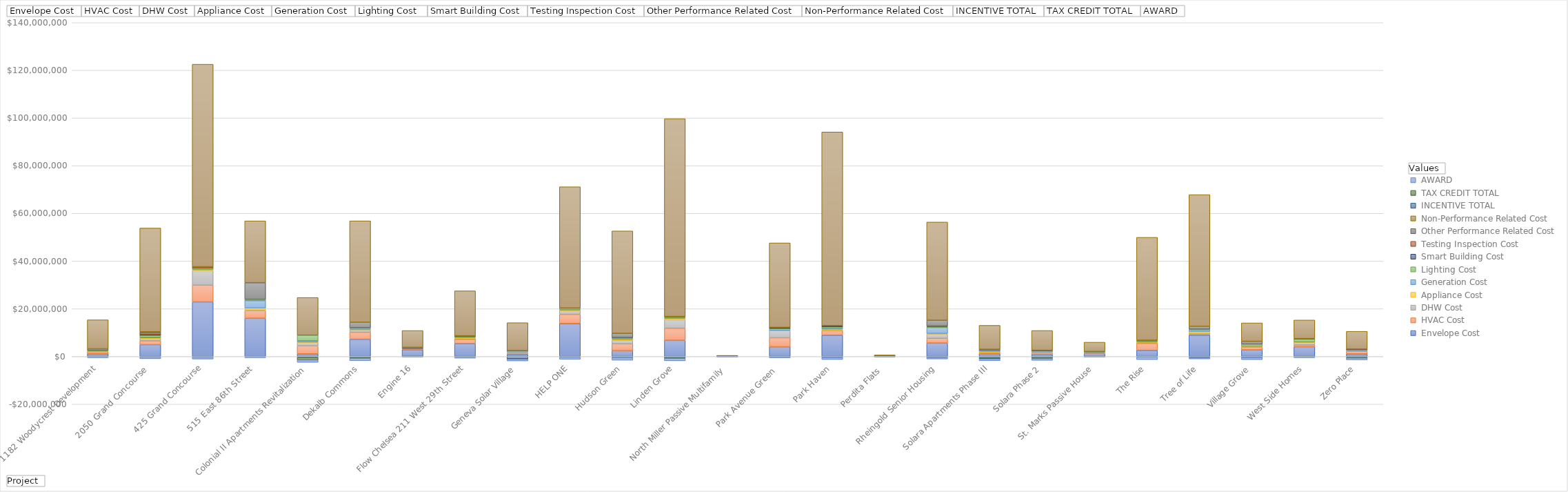
| Category |  Envelope Cost |  HVAC Cost |  DHW Cost |  Appliance Cost |  Generation Cost |  Lighting Cost  |  Smart Building Cost |  Testing Inspection Cost |  Other Performance Related Cost |  Non-Performance Related Cost |  INCENTIVE TOTAL |  TAX CREDIT TOTAL |  AWARD |
|---|---|---|---|---|---|---|---|---|---|---|---|---|---|
| 1182 Woodycrest Development | 1130801.59 | 879051 | 240000 | 140736 | 0 | 200000 | 0 | 0 | 645948 | 12128463.81 | -169700 | 0 | -350931 |
| 2050 Grand Concourse  | 4967658.213 | 1592848.164 | 1059435.67 | 183414 | 254596.04 | 807248.033 | 325541.73 | 689125 | 502235.25 | 43460922.157 | -235624 | -55599 | -647500 |
| 425 Grand Concourse | 22898351.84 | 6998906 | 6106206 | 434701 | 0 | 617156 | 0 | 546700 | 50300 | 84887679.16 | -300000 | 0 | -750000 |
| 515 East 86th Street  | 16052777 | 3168000 | 307000 | 788116 | 3072683 | 553272 | 0 | 0 | 7001039.706 | 25917381.706 | -99617.8 | 0 | -425000 |
| Colonial II Apartments Revitalization | 1096000 | 3357410 | 1467133 | 169375 | 505440 | 2335100 | 0 | 0 | 0 | 15804978 | -459000 | -990064 | -1000000 |
| Dekalb Commons | 7230000 | 2925000 | 1050000 | 151700 | 374500 | 340000 | 0 | 0 | 2283800 | 42507863.5 | -619232 | -111363 | -1000000 |
| Engine 16 | 2859020.71 | 245125 | 153472 | 69500 | 39415 | 41750 | 0 | 0 | 423479.42 | 7052230.21 | -6400 | -19088 | -167458.5 |
| Flow Chelsea 211 West 29th Street | 5414207.77 | 1755748.5 | 356582 | 462963.94 | 157000 | 246715.67 | 50000 | 53050 | 198249.76 | 18820784.21 | -145660 | -49394 | -500000 |
| Geneva Solar Village | 823994 | 520783 | 73950 | 410325 | 571158 | 41511 | 0 | 0 | 64637.931 | 11648847 | -978000 | -140885 | -727236 |
| HELP ONE | 13820490 | 3860000 | 1521600 | 291269 | 263398 | 468693 | 0 | 142906 | 0 | 50797762.19 | -300000 | 0 | -850000 |
| Hudson Green | 2407694.931 | 2900092.81 | 1545000 | 374147 | 411400 | 281632.424 | 0 | 37000 | 1742800 | 42929555.668 | -555000 | 0 | -1000000 |
| Linden Grove | 6779865.441 | 5074592.04 | 3559889.291 | 572717.547 | 232500 | 400000 | 0 | 189900 | 0 | 82895592.98 | -700000 | -100000 | -1000000 |
| North Miller Passive Multifamily | 96977.91 | 8539.65 | 5400 | 7000 | 27815 | 2147.13 | 2300 | 7650 | 5000 | 289777.66 | -12600 | -14255 | -39467 |
| Park Avenue Green  | 4079691.16 | 3770484.94 | 3048214.42 | 63526 | 682830 | 141119.7 | 365000 | 73675 | 0 | 35399236.42 | -270600 | -20400 | -250000 |
| Park Haven | 8918168 | 2028100 | 91500 | 404336 | 339261 | 639515.63 | 403739.06 | 45775 | 100000 | 81164882.15 | -508200 | 0 | -750000 |
| Perdita Flats  | 64925.8 | 30000 | 12400 | 21000 | 34600 | 750 | 0 | 0 | 0 | 500484.2 | -6400 | -14933 | -59976 |
| Rheingold Senior Housing | 5651719.02 | 1965400 | 1791250 | 239216.96 | 2535918.75 | 294500 | 0 | 310000 | 2405000 | 41171001.61 | -339240 | -52250 | -637500 |
| Solara Apartments Phase III | 1158315 | 575523 | 60000 | 293556 | 678000 | 51000 | 45000 | 22372 | 131321 | 10040663.95 | -587500 | -415800 | -750000 |
| Solara Phase 2 | 884237 | 575523 | 60000 | 299400 | 678000 | 51000 | 45000 | 20826 | 0 | 8280460 | -571050 | -283035 | -750000 |
| St. Marks Passive House | 1286500 | 275000 | 105000 | 120000 | 40000 | 80000 | 0 | 0 | 186730 | 3887850 | -13608 | -29906 | -203082 |
| The Rise | 2579052 | 2922400 | 300000 | 212800 | 273845 | 280000 | 0 | 0 | 260966 | 43128939.45 | -279680 | 0 | -1000000 |
| Tree of Life | 8908493.25 | 366127.83 | 575000 | 625000 | 679194.51 | 300000 | 0 | 0 | 1195947.3 | 55205071.24 | -320000 | -185526 | -500000 |
| Village Grove | 2770500 | 1174200 | 320280 | 30642.95 | 0 | 888684 | 0 | 0 | 1189475 | 7697481.89 | -513976 | 0 | -792438 |
| West Side Homes | 4104825.56 | 695077 | 1134500 | 99865 | 119136.74 | 1135010 | 0 | 0 | 224844.694 | 7763945.9 | -115819 | -27878 | -362620 |
| Zero Place | 1101500 | 1100000 | 50000 | 110630 | 475000 | 10000 | 215000 | 45000 | 0 | 7440183 | -315040 | -313400 | -750000 |